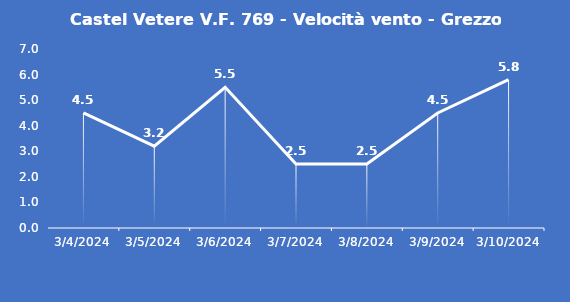
| Category | Castel Vetere V.F. 769 - Velocità vento - Grezzo (m/s) |
|---|---|
| 3/4/24 | 4.5 |
| 3/5/24 | 3.2 |
| 3/6/24 | 5.5 |
| 3/7/24 | 2.5 |
| 3/8/24 | 2.5 |
| 3/9/24 | 4.5 |
| 3/10/24 | 5.8 |